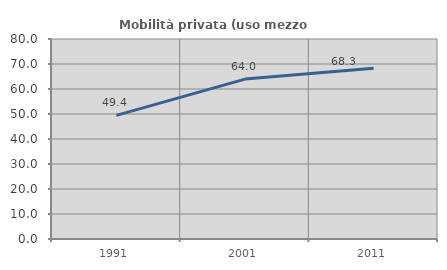
| Category | Mobilità privata (uso mezzo privato) |
|---|---|
| 1991.0 | 49.449 |
| 2001.0 | 63.963 |
| 2011.0 | 68.287 |